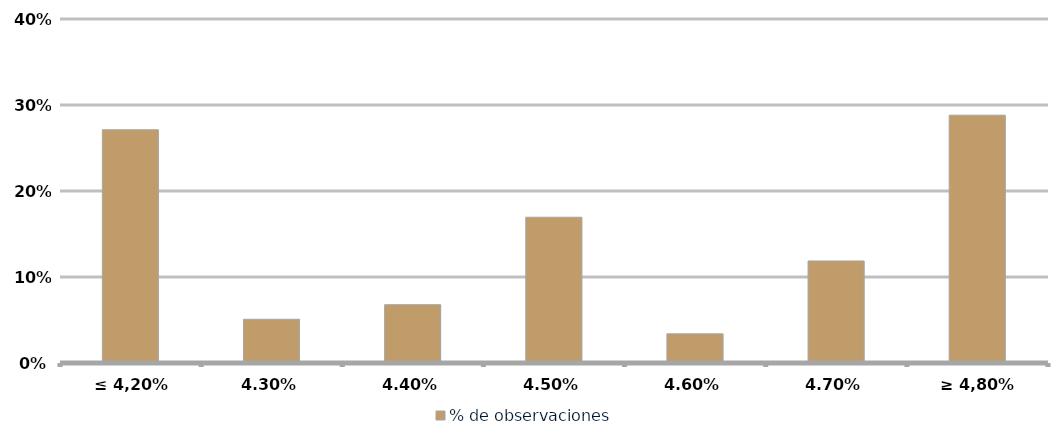
| Category | % de observaciones  |
|---|---|
| ≤ 4,20% | 0.271 |
| 4,30% | 0.051 |
| 4,40% | 0.068 |
| 4,50% | 0.169 |
| 4,60% | 0.034 |
| 4,70% | 0.119 |
| ≥ 4,80% | 0.288 |